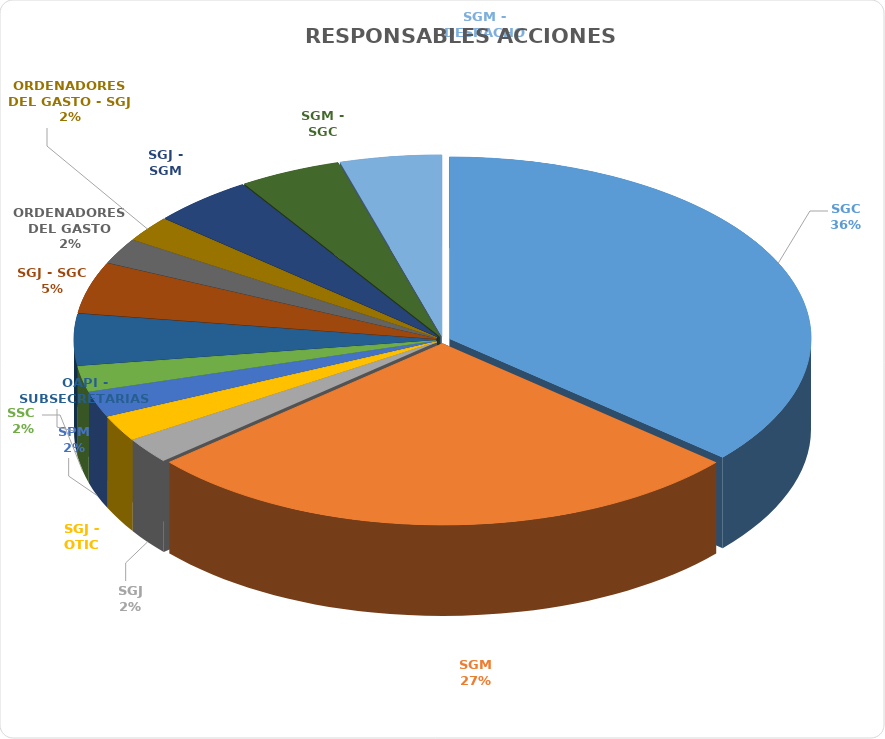
| Category | Series 0 |
|---|---|
| SGC | 16 |
| SGM | 12 |
| SGJ | 1 |
| SGJ - OTIC | 1 |
| SPM | 1 |
| SSC  | 1 |
| OAPI - SUBSECRETARIAS | 2 |
| SGJ - SGC | 2 |
| ORDENADORES DEL GASTO | 1 |
| ORDENADORES DEL GASTO - SGJ | 1 |
| SGJ - SGM | 2 |
| SGM - SGC | 2 |
| SGM - DESPACHO | 2 |